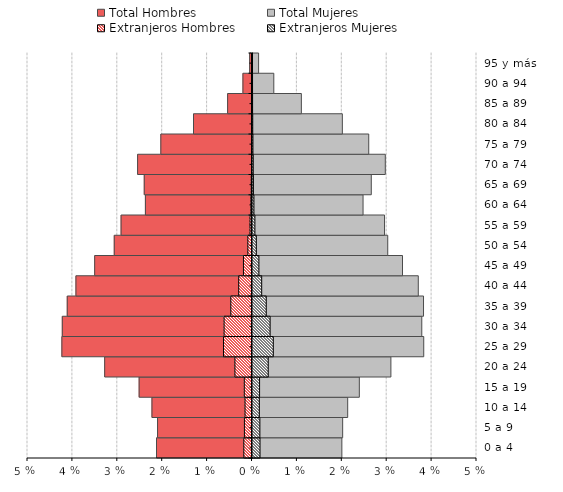
| Category | Total Hombres | Total Mujeres | Extranjeros Hombres | Extranjeros Mujeres |
|---|---|---|---|---|
| 0 a 4 | -0.021 | 0.02 | -0.002 | 0.002 |
| 5 a 9 | -0.021 | 0.02 | -0.002 | 0.002 |
| 10 a 14 | -0.022 | 0.021 | -0.002 | 0.002 |
| 15 a 19 | -0.025 | 0.024 | -0.002 | 0.002 |
| 20 a 24 | -0.033 | 0.031 | -0.004 | 0.004 |
| 25 a 29 | -0.042 | 0.038 | -0.006 | 0.005 |
| 30 a 34 | -0.042 | 0.038 | -0.006 | 0.004 |
| 35 a 39 | -0.041 | 0.038 | -0.005 | 0.003 |
| 40 a 44 | -0.039 | 0.037 | -0.003 | 0.002 |
| 45 a 49 | -0.035 | 0.033 | -0.002 | 0.001 |
| 50 a 54 | -0.031 | 0.03 | -0.001 | 0.001 |
| 55 a 59 | -0.029 | 0.029 | 0 | 0.001 |
| 60 a 64 | -0.024 | 0.025 | 0 | 0 |
| 65 a 69 | -0.024 | 0.026 | 0 | 0 |
| 70 a 74 | -0.025 | 0.03 | 0 | 0 |
| 75 a 79 | -0.02 | 0.026 | 0 | 0 |
| 80 a 84 | -0.013 | 0.02 | 0 | 0 |
| 85 a 89 | -0.005 | 0.011 | 0 | 0 |
| 90 a 94 | -0.002 | 0.005 | 0 | 0 |
| 95 y más | -0.001 | 0.001 | 0 | 0 |